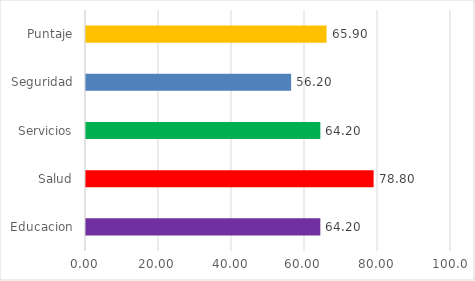
| Category | Series 0 |
|---|---|
| Educacion | 64.2 |
| Salud | 78.8 |
| Servicios | 64.2 |
| Seguridad | 56.2 |
| Puntaje | 65.9 |